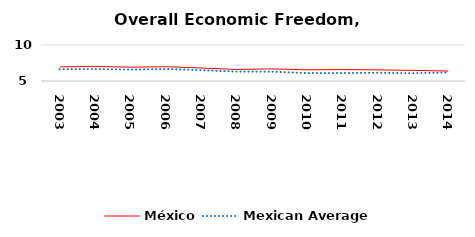
| Category | México | Mexican Average  |
|---|---|---|
| 2003.0 | 6.957 | 6.632 |
| 2004.0 | 7.032 | 6.678 |
| 2005.0 | 6.919 | 6.582 |
| 2006.0 | 6.984 | 6.668 |
| 2007.0 | 6.813 | 6.508 |
| 2008.0 | 6.6 | 6.3 |
| 2009.0 | 6.685 | 6.3 |
| 2010.0 | 6.557 | 6.105 |
| 2011.0 | 6.593 | 6.103 |
| 2012.0 | 6.542 | 6.144 |
| 2013.0 | 6.477 | 6.087 |
| 2014.0 | 6.384 | 6.195 |